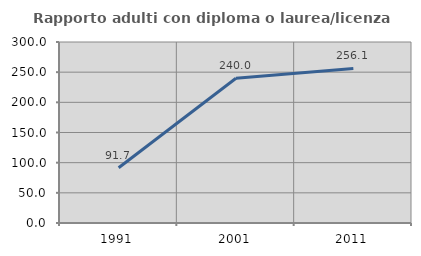
| Category | Rapporto adulti con diploma o laurea/licenza media  |
|---|---|
| 1991.0 | 91.667 |
| 2001.0 | 240 |
| 2011.0 | 256.098 |